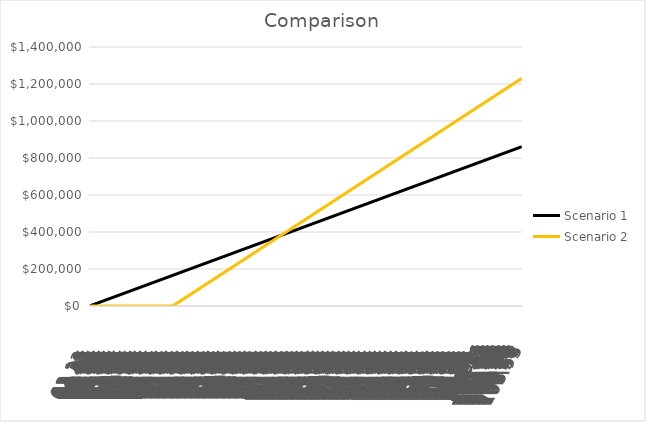
| Category | Scenario 1 | Scenario 2 |
|---|---|---|
| 62.11780821917808 | 1725.5 | 0 |
| 62.202739726027396 | 3451.001 | 0 |
| 62.28493150684932 | 5176.501 | 0 |
| 62.36986301369863 | 6902.002 | 0 |
| 62.45479452054794 | 8627.502 | 0 |
| 62.53150684931507 | 10353.003 | 0 |
| 62.61643835616438 | 12078.503 | 0 |
| 62.6986301369863 | 13804.004 | 0 |
| 62.78356164383562 | 15529.504 | 0 |
| 62.865753424657534 | 17255.005 | 0 |
| 62.95068493150685 | 18980.505 | 0 |
| 63.035616438356165 | 20706.006 | 0 |
| 63.11780821917808 | 22431.506 | 0 |
| 63.202739726027396 | 24157.007 | 0 |
| 63.28493150684932 | 25882.507 | 0 |
| 63.36986301369863 | 27608.008 | 0 |
| 63.45479452054794 | 29333.508 | 0 |
| 63.53150684931507 | 31059.009 | 0 |
| 63.61643835616438 | 32784.509 | 0 |
| 63.6986301369863 | 34510.01 | 0 |
| 63.78356164383562 | 36235.51 | 0 |
| 63.865753424657534 | 37961.011 | 0 |
| 63.95068493150685 | 39686.511 | 0 |
| 64.03561643835616 | 41412.012 | 0 |
| 64.11780821917809 | 43137.512 | 0 |
| 64.2027397260274 | 44863.013 | 0 |
| 64.28493150684932 | 46588.513 | 0 |
| 64.36986301369863 | 48314.014 | 0 |
| 64.45479452054795 | 50039.514 | 0 |
| 64.53424657534246 | 51765.015 | 0 |
| 64.61917808219178 | 53490.515 | 0 |
| 64.7013698630137 | 55216.016 | 0 |
| 64.78630136986301 | 56941.516 | 0 |
| 64.86849315068493 | 58667.017 | 0 |
| 64.95342465753424 | 60392.517 | 0 |
| 65.03835616438356 | 62118.018 | 0 |
| 65.12054794520547 | 63843.518 | 0 |
| 65.20547945205479 | 65569.019 | 0 |
| 65.28767123287672 | 67294.519 | 0 |
| 65.37260273972603 | 69020.019 | 0 |
| 65.45753424657535 | 70745.52 | 0 |
| 65.53424657534246 | 72471.02 | 0 |
| 65.61917808219178 | 74196.521 | 0 |
| 65.7013698630137 | 75922.021 | 0 |
| 65.78630136986301 | 77647.522 | 0 |
| 65.86849315068493 | 79373.022 | 0 |
| 65.95342465753424 | 81098.523 | 0 |
| 66.03835616438356 | 82824.023 | 0 |
| 66.12054794520547 | 84549.524 | 0 |
| 66.20547945205479 | 86275.024 | 0 |
| 66.28767123287672 | 88000.525 | 0 |
| 66.37260273972603 | 89726.025 | 0 |
| 66.45753424657535 | 91451.526 | 0 |
| 66.53424657534246 | 93177.026 | 0 |
| 66.61917808219178 | 94902.527 | 0 |
| 66.7013698630137 | 96628.027 | 0 |
| 66.78630136986301 | 98353.528 | 0 |
| 66.86849315068493 | 100079.028 | 0 |
| 66.95342465753424 | 101804.529 | 0 |
| 67.03835616438356 | 103530.029 | 0 |
| 67.12054794520547 | 105255.53 | 0 |
| 67.20547945205479 | 106981.03 | 0 |
| 67.28767123287672 | 108706.531 | 0 |
| 67.37260273972603 | 110432.031 | 0 |
| 67.45753424657535 | 112157.532 | 0 |
| 67.53424657534246 | 113883.032 | 0 |
| 67.61917808219178 | 115608.533 | 0 |
| 67.7013698630137 | 117334.033 | 0 |
| 67.78630136986301 | 119059.534 | 0 |
| 67.86849315068493 | 120785.034 | 0 |
| 67.95342465753424 | 122510.535 | 0 |
| 68.03835616438356 | 124236.035 | 0 |
| 68.12054794520547 | 125961.536 | 0 |
| 68.20547945205479 | 127687.036 | 0 |
| 68.28767123287672 | 129412.537 | 0 |
| 68.37260273972603 | 131138.037 | 0 |
| 68.45753424657535 | 132863.538 | 0 |
| 68.53698630136986 | 134589.038 | 0 |
| 68.62191780821918 | 136314.538 | 0 |
| 68.7041095890411 | 138040.039 | 0 |
| 68.78904109589041 | 139765.539 | 0 |
| 68.87123287671233 | 141491.04 | 0 |
| 68.95616438356164 | 143216.54 | 0 |
| 69.04109589041096 | 144942.041 | 0 |
| 69.12328767123287 | 146667.541 | 0 |
| 69.20821917808219 | 148393.042 | 0 |
| 69.2904109589041 | 150118.542 | 0 |
| 69.37534246575342 | 151844.043 | 0 |
| 69.46027397260274 | 153569.543 | 0 |
| 69.53698630136986 | 155295.044 | 0 |
| 69.62191780821918 | 157020.544 | 0 |
| 69.7041095890411 | 158746.045 | 0 |
| 69.78904109589041 | 160471.545 | 0 |
| 69.87123287671233 | 162197.046 | 0 |
| 69.95616438356164 | 163922.546 | 0 |
| 70.04109589041096 | 165648.047 | 0 |
| 70.12328767123287 | 167373.547 | 3053.12 |
| 70.20821917808219 | 169099.048 | 6106.24 |
| 70.2904109589041 | 170824.548 | 9159.36 |
| 70.37534246575342 | 172550.049 | 12212.48 |
| 70.46027397260274 | 174275.549 | 15265.6 |
| 70.53698630136986 | 176001.05 | 18318.72 |
| 70.62191780821918 | 177726.55 | 21371.84 |
| 70.7041095890411 | 179452.051 | 24424.96 |
| 70.78904109589041 | 181177.551 | 27478.08 |
| 70.87123287671233 | 182903.052 | 30531.2 |
| 70.95616438356164 | 184628.552 | 33584.32 |
| 71.04109589041096 | 186354.053 | 36637.44 |
| 71.12328767123287 | 188079.553 | 39690.56 |
| 71.20821917808219 | 189805.054 | 42743.68 |
| 71.2904109589041 | 191530.554 | 45796.8 |
| 71.37534246575342 | 193256.055 | 48849.92 |
| 71.46027397260274 | 194981.555 | 51903.04 |
| 71.53698630136986 | 196707.056 | 54956.16 |
| 71.62191780821918 | 198432.556 | 58009.28 |
| 71.7041095890411 | 200158.056 | 61062.4 |
| 71.78904109589041 | 201883.557 | 64115.52 |
| 71.87123287671233 | 203609.057 | 67168.64 |
| 71.95616438356164 | 205334.558 | 70221.76 |
| 72.04109589041096 | 207060.058 | 73274.88 |
| 72.12328767123287 | 208785.559 | 76328 |
| 72.20821917808219 | 210511.059 | 79381.12 |
| 72.2904109589041 | 212236.56 | 82434.24 |
| 72.37534246575342 | 213962.06 | 85487.36 |
| 72.46027397260274 | 215687.561 | 88540.48 |
| 72.53972602739726 | 217413.061 | 91593.6 |
| 72.62465753424658 | 219138.562 | 94646.72 |
| 72.7068493150685 | 220864.062 | 97699.84 |
| 72.79178082191781 | 222589.563 | 100752.96 |
| 72.87397260273973 | 224315.063 | 103806.08 |
| 72.95890410958904 | 226040.564 | 106859.2 |
| 73.04383561643836 | 227766.064 | 109912.32 |
| 73.12602739726027 | 229491.565 | 112965.44 |
| 73.21095890410959 | 231217.065 | 116018.56 |
| 73.2931506849315 | 232942.566 | 119071.68 |
| 73.37808219178082 | 234668.066 | 122124.8 |
| 73.46301369863014 | 236393.567 | 125177.92 |
| 73.53972602739726 | 238119.067 | 128231.04 |
| 73.62465753424658 | 239844.568 | 131284.16 |
| 73.7068493150685 | 241570.068 | 134337.28 |
| 73.79178082191781 | 243295.569 | 137390.4 |
| 73.87397260273973 | 245021.069 | 140443.52 |
| 73.95890410958904 | 246746.57 | 143496.64 |
| 74.04383561643836 | 248472.07 | 146549.76 |
| 74.12602739726027 | 250197.571 | 149602.88 |
| 74.21095890410959 | 251923.071 | 152656 |
| 74.2931506849315 | 253648.572 | 155709.12 |
| 74.37808219178082 | 255374.072 | 158762.24 |
| 74.46301369863014 | 257099.573 | 161815.36 |
| 74.53972602739726 | 258825.073 | 164868.48 |
| 74.62465753424658 | 260550.574 | 167921.6 |
| 74.7068493150685 | 262276.074 | 170974.72 |
| 74.79178082191781 | 264001.575 | 174027.84 |
| 74.87397260273973 | 265727.075 | 177080.96 |
| 74.95890410958904 | 267452.575 | 180134.08 |
| 75.04383561643836 | 269178.076 | 183187.2 |
| 75.12602739726027 | 270903.576 | 186240.32 |
| 75.21095890410959 | 272629.077 | 189293.44 |
| 75.2931506849315 | 274354.577 | 192346.56 |
| 75.37808219178082 | 276080.078 | 195399.68 |
| 75.46301369863014 | 277805.578 | 198452.8 |
| 75.53972602739726 | 279531.079 | 201505.92 |
| 75.62465753424658 | 281256.579 | 204559.04 |
| 75.7068493150685 | 282982.08 | 207612.16 |
| 75.79178082191781 | 284707.58 | 210665.28 |
| 75.87397260273973 | 286433.081 | 213718.4 |
| 75.95890410958904 | 288158.581 | 216771.52 |
| 76.04383561643836 | 289884.082 | 219824.64 |
| 76.12602739726027 | 291609.582 | 222877.76 |
| 76.21095890410959 | 293335.083 | 225930.88 |
| 76.2931506849315 | 295060.583 | 228984 |
| 76.37808219178082 | 296786.084 | 232037.12 |
| 76.46301369863014 | 298511.584 | 235090.24 |
| 76.54246575342465 | 300237.085 | 238143.36 |
| 76.62739726027397 | 301962.585 | 241196.48 |
| 76.7095890410959 | 303688.086 | 244249.6 |
| 76.79452054794521 | 305413.586 | 247302.72 |
| 76.87671232876713 | 307139.087 | 250355.84 |
| 76.96164383561644 | 308864.587 | 253408.96 |
| 77.04657534246576 | 310590.088 | 256462.08 |
| 77.12876712328767 | 312315.588 | 259515.2 |
| 77.21369863013699 | 314041.089 | 262568.32 |
| 77.2958904109589 | 315766.589 | 265621.44 |
| 77.38082191780822 | 317492.09 | 268674.56 |
| 77.46575342465754 | 319217.59 | 271727.68 |
| 77.54246575342465 | 320943.091 | 274780.8 |
| 77.62739726027397 | 322668.591 | 277833.92 |
| 77.7095890410959 | 324394.092 | 280887.04 |
| 77.79452054794521 | 326119.592 | 283940.16 |
| 77.87671232876713 | 327845.093 | 286993.28 |
| 77.96164383561644 | 329570.593 | 290046.4 |
| 78.04657534246576 | 331296.094 | 293099.52 |
| 78.12876712328767 | 333021.594 | 296152.64 |
| 78.21369863013699 | 334747.094 | 299205.76 |
| 78.2958904109589 | 336472.595 | 302258.88 |
| 78.38082191780822 | 338198.095 | 305312 |
| 78.46575342465754 | 339923.596 | 308365.12 |
| 78.54246575342465 | 341649.096 | 311418.24 |
| 78.62739726027397 | 343374.597 | 314471.36 |
| 78.7095890410959 | 345100.097 | 317524.48 |
| 78.79452054794521 | 346825.598 | 320577.6 |
| 78.87671232876713 | 348551.098 | 323630.72 |
| 78.96164383561644 | 350276.599 | 326683.84 |
| 79.04657534246576 | 352002.099 | 329736.96 |
| 79.12876712328767 | 353727.6 | 332790.08 |
| 79.21369863013699 | 355453.1 | 335843.2 |
| 79.2958904109589 | 357178.601 | 338896.32 |
| 79.38082191780822 | 358904.101 | 341949.44 |
| 79.46575342465754 | 360629.602 | 345002.56 |
| 79.54246575342465 | 362355.102 | 348055.68 |
| 79.62739726027397 | 364080.603 | 351108.8 |
| 79.7095890410959 | 365806.103 | 354161.92 |
| 79.79452054794521 | 367531.604 | 357215.04 |
| 79.87671232876713 | 369257.104 | 360268.16 |
| 79.96164383561644 | 370982.605 | 363321.28 |
| 80.04657534246576 | 372708.105 | 366374.4 |
| 80.12876712328767 | 374433.606 | 369427.52 |
| 80.21369863013699 | 376159.106 | 372480.64 |
| 80.2958904109589 | 377884.607 | 375533.76 |
| 80.38082191780822 | 379610.107 | 378586.88 |
| 80.46575342465754 | 381335.608 | 381640 |
| 80.54520547945205 | 383061.108 | 384693.12 |
| 80.63013698630137 | 384786.609 | 387746.24 |
| 80.71232876712328 | 386512.109 | 390799.36 |
| 80.7972602739726 | 388237.61 | 393852.48 |
| 80.87945205479453 | 389963.11 | 396905.6 |
| 80.96438356164384 | 391688.611 | 399958.72 |
| 81.04931506849314 | 393414.111 | 403011.84 |
| 81.13150684931507 | 395139.612 | 406064.96 |
| 81.21643835616439 | 396865.112 | 409118.08 |
| 81.2986301369863 | 398590.613 | 412171.2 |
| 81.38356164383562 | 400316.113 | 415224.32 |
| 81.46849315068494 | 402041.613 | 418277.44 |
| 81.54520547945205 | 403767.114 | 421330.56 |
| 81.63013698630137 | 405492.614 | 424383.68 |
| 81.71232876712328 | 407218.115 | 427436.8 |
| 81.7972602739726 | 408943.615 | 430489.92 |
| 81.87945205479453 | 410669.116 | 433543.04 |
| 81.96438356164384 | 412394.616 | 436596.16 |
| 82.04931506849314 | 414120.117 | 439649.28 |
| 82.13150684931507 | 415845.617 | 442702.4 |
| 82.21643835616439 | 417571.118 | 445755.52 |
| 82.2986301369863 | 419296.618 | 448808.64 |
| 82.38356164383562 | 421022.119 | 451861.76 |
| 82.46849315068494 | 422747.619 | 454914.88 |
| 82.54520547945205 | 424473.12 | 457968 |
| 82.63013698630137 | 426198.62 | 461021.12 |
| 82.71232876712328 | 427924.121 | 464074.24 |
| 82.7972602739726 | 429649.621 | 467127.36 |
| 82.87945205479453 | 431375.122 | 470180.48 |
| 82.96438356164384 | 433100.622 | 473233.6 |
| 83.04931506849314 | 434826.123 | 476286.72 |
| 83.13150684931507 | 436551.623 | 479339.84 |
| 83.21643835616439 | 438277.124 | 482392.96 |
| 83.2986301369863 | 440002.624 | 485446.08 |
| 83.38356164383562 | 441728.125 | 488499.2 |
| 83.46849315068494 | 443453.625 | 491552.32 |
| 83.54520547945205 | 445179.126 | 494605.44 |
| 83.63013698630137 | 446904.626 | 497658.56 |
| 83.71232876712328 | 448630.127 | 500711.68 |
| 83.7972602739726 | 450355.627 | 503764.8 |
| 83.87945205479453 | 452081.128 | 506817.92 |
| 83.96438356164384 | 453806.628 | 509871.04 |
| 84.04931506849314 | 455532.129 | 512924.16 |
| 84.13150684931507 | 457257.629 | 515977.28 |
| 84.21643835616439 | 458983.13 | 519030.4 |
| 84.2986301369863 | 460708.63 | 522083.52 |
| 84.38356164383562 | 462434.131 | 525136.64 |
| 84.46849315068494 | 464159.631 | 528189.76 |
| 84.54794520547945 | 465885.131 | 531242.88 |
| 84.63287671232877 | 467610.632 | 534296 |
| 84.71506849315068 | 469336.132 | 537349.12 |
| 84.8 | 471061.633 | 540402.24 |
| 84.88219178082191 | 472787.133 | 543455.36 |
| 84.96712328767123 | 474512.634 | 546508.48 |
| 85.05205479452054 | 476238.134 | 549561.6 |
| 85.13424657534246 | 477963.635 | 552614.72 |
| 85.21917808219177 | 479689.135 | 555667.84 |
| 85.3013698630137 | 481414.636 | 558720.96 |
| 85.38630136986302 | 483140.136 | 561774.08 |
| 85.47123287671234 | 484865.637 | 564827.2 |
| 85.54794520547945 | 486591.137 | 567880.32 |
| 85.63287671232877 | 488316.638 | 570933.44 |
| 85.71506849315068 | 490042.138 | 573986.56 |
| 85.8 | 491767.639 | 577039.68 |
| 85.88219178082191 | 493493.139 | 580092.8 |
| 85.96712328767123 | 495218.64 | 583145.92 |
| 86.05205479452054 | 496944.14 | 586199.04 |
| 86.13424657534246 | 498669.641 | 589252.16 |
| 86.21917808219177 | 500395.141 | 592305.28 |
| 86.3013698630137 | 502120.642 | 595358.4 |
| 86.38630136986302 | 503846.142 | 598411.52 |
| 86.47123287671234 | 505571.643 | 601464.64 |
| 86.54794520547945 | 507297.143 | 604517.76 |
| 86.63287671232877 | 509022.644 | 607570.88 |
| 86.71506849315068 | 510748.144 | 610624 |
| 86.8 | 512473.645 | 613677.12 |
| 86.88219178082191 | 514199.145 | 616730.24 |
| 86.96712328767123 | 515924.646 | 619783.36 |
| 87.05205479452054 | 517650.146 | 622836.48 |
| 87.13424657534246 | 519375.647 | 625889.6 |
| 87.21917808219177 | 521101.147 | 628942.72 |
| 87.3013698630137 | 522826.648 | 631995.84 |
| 87.38630136986302 | 524552.148 | 635048.96 |
| 87.47123287671234 | 526277.649 | 638102.08 |
| 87.54794520547945 | 528003.149 | 641155.2 |
| 87.63287671232877 | 529728.65 | 644208.32 |
| 87.71506849315068 | 531454.15 | 647261.44 |
| 87.8 | 533179.65 | 650314.56 |
| 87.88219178082191 | 534905.151 | 653367.68 |
| 87.96712328767123 | 536630.651 | 656420.8 |
| 88.05205479452054 | 538356.152 | 659473.92 |
| 88.13424657534246 | 540081.652 | 662527.04 |
| 88.21917808219177 | 541807.153 | 665580.16 |
| 88.3013698630137 | 543532.653 | 668633.28 |
| 88.38630136986302 | 545258.154 | 671686.4 |
| 88.47123287671234 | 546983.654 | 674739.52 |
| 88.55068493150685 | 548709.155 | 677792.64 |
| 88.63561643835617 | 550434.655 | 680845.76 |
| 88.71780821917808 | 552160.156 | 683898.88 |
| 88.8027397260274 | 553885.656 | 686952 |
| 88.88493150684931 | 555611.157 | 690005.12 |
| 88.96986301369863 | 557336.657 | 693058.24 |
| 89.05479452054794 | 559062.158 | 696111.36 |
| 89.13698630136986 | 560787.658 | 699164.48 |
| 89.22191780821917 | 562513.159 | 702217.6 |
| 89.30410958904109 | 564238.659 | 705270.72 |
| 89.3890410958904 | 565964.16 | 708323.84 |
| 89.47397260273972 | 567689.66 | 711376.96 |
| 89.55068493150685 | 569415.161 | 714430.08 |
| 89.63561643835617 | 571140.661 | 717483.2 |
| 89.71780821917808 | 572866.162 | 720536.32 |
| 89.8027397260274 | 574591.662 | 723589.44 |
| 89.88493150684931 | 576317.163 | 726642.56 |
| 89.96986301369863 | 578042.663 | 729695.68 |
| 90.05479452054794 | 579768.164 | 732748.8 |
| 90.13698630136986 | 581493.664 | 735801.92 |
| 90.22191780821917 | 583219.165 | 738855.04 |
| 90.30410958904109 | 584944.665 | 741908.16 |
| 90.3890410958904 | 586670.166 | 744961.28 |
| 90.47397260273972 | 588395.666 | 748014.4 |
| 90.55068493150685 | 590121.167 | 751067.52 |
| 90.63561643835617 | 591846.667 | 754120.64 |
| 90.71780821917808 | 593572.168 | 757173.76 |
| 90.8027397260274 | 595297.668 | 760226.88 |
| 90.88493150684931 | 597023.169 | 763280 |
| 90.96986301369863 | 598748.669 | 766333.12 |
| 91.05479452054794 | 600474.169 | 769386.24 |
| 91.13698630136986 | 602199.67 | 772439.36 |
| 91.22191780821917 | 603925.17 | 775492.48 |
| 91.30410958904109 | 605650.671 | 778545.6 |
| 91.3890410958904 | 607376.171 | 781598.72 |
| 91.47397260273972 | 609101.672 | 784651.84 |
| 91.55068493150685 | 610827.172 | 787704.96 |
| 91.63561643835617 | 612552.673 | 790758.08 |
| 91.71780821917808 | 614278.173 | 793811.2 |
| 91.8027397260274 | 616003.674 | 796864.32 |
| 91.88493150684931 | 617729.174 | 799917.44 |
| 91.96986301369863 | 619454.675 | 802970.56 |
| 92.05479452054794 | 621180.175 | 806023.68 |
| 92.13698630136986 | 622905.676 | 809076.8 |
| 92.22191780821917 | 624631.176 | 812129.92 |
| 92.30410958904109 | 626356.677 | 815183.04 |
| 92.3890410958904 | 628082.177 | 818236.16 |
| 92.47397260273972 | 629807.678 | 821289.28 |
| 92.55342465753425 | 631533.178 | 824342.4 |
| 92.63835616438357 | 633258.679 | 827395.52 |
| 92.72054794520548 | 634984.179 | 830448.64 |
| 92.8054794520548 | 636709.68 | 833501.76 |
| 92.88767123287671 | 638435.18 | 836554.88 |
| 92.97260273972603 | 640160.681 | 839608 |
| 93.05753424657534 | 641886.181 | 842661.12 |
| 93.13972602739726 | 643611.682 | 845714.24 |
| 93.22465753424657 | 645337.182 | 848767.36 |
| 93.30684931506849 | 647062.683 | 851820.48 |
| 93.3917808219178 | 648788.183 | 854873.6 |
| 93.47671232876712 | 650513.684 | 857926.72 |
| 93.55342465753425 | 652239.184 | 860979.84 |
| 93.63835616438357 | 653964.685 | 864032.96 |
| 93.72054794520548 | 655690.185 | 867086.08 |
| 93.8054794520548 | 657415.686 | 870139.2 |
| 93.88767123287671 | 659141.186 | 873192.32 |
| 93.97260273972603 | 660866.687 | 876245.44 |
| 94.05753424657534 | 662592.187 | 879298.56 |
| 94.13972602739726 | 664317.688 | 882351.68 |
| 94.22465753424657 | 666043.188 | 885404.8 |
| 94.30684931506849 | 667768.688 | 888457.92 |
| 94.3917808219178 | 669494.189 | 891511.04 |
| 94.47671232876712 | 671219.689 | 894564.16 |
| 94.55342465753425 | 672945.19 | 897617.28 |
| 94.63835616438357 | 674670.69 | 900670.4 |
| 94.72054794520548 | 676396.191 | 903723.52 |
| 94.8054794520548 | 678121.691 | 906776.64 |
| 94.88767123287671 | 679847.192 | 909829.76 |
| 94.97260273972603 | 681572.692 | 912882.88 |
| 95.05753424657534 | 683298.193 | 915936 |
| 95.13972602739726 | 685023.693 | 918989.12 |
| 95.22465753424657 | 686749.194 | 922042.24 |
| 95.30684931506849 | 688474.694 | 925095.36 |
| 95.3917808219178 | 690200.195 | 928148.48 |
| 95.47671232876712 | 691925.695 | 931201.6 |
| 95.55342465753425 | 693651.196 | 934254.72 |
| 95.63835616438357 | 695376.696 | 937307.84 |
| 95.72054794520548 | 697102.197 | 940360.96 |
| 95.8054794520548 | 698827.697 | 943414.08 |
| 95.88767123287671 | 700553.198 | 946467.2 |
| 95.97260273972603 | 702278.698 | 949520.32 |
| 96.05753424657534 | 704004.199 | 952573.44 |
| 96.13972602739726 | 705729.699 | 955626.56 |
| 96.22465753424657 | 707455.2 | 958679.68 |
| 96.30684931506849 | 709180.7 | 961732.8 |
| 96.3917808219178 | 710906.201 | 964785.92 |
| 96.47671232876712 | 712631.701 | 967839.04 |
| 96.55616438356165 | 714357.202 | 970892.16 |
| 96.64109589041095 | 716082.702 | 973945.28 |
| 96.72328767123288 | 717808.203 | 976998.4 |
| 96.8082191780822 | 719533.703 | 980051.52 |
| 96.89041095890411 | 721259.204 | 983104.64 |
| 96.97534246575343 | 722984.704 | 986157.76 |
| 97.06027397260274 | 724710.205 | 989210.88 |
| 97.14246575342466 | 726435.705 | 992264 |
| 97.22739726027397 | 728161.206 | 995317.12 |
| 97.30958904109589 | 729886.706 | 998370.24 |
| 97.3945205479452 | 731612.206 | 1001423.36 |
| 97.47945205479452 | 733337.707 | 1004476.48 |
| 97.55616438356165 | 735063.207 | 1007529.6 |
| 97.64109589041095 | 736788.708 | 1010582.72 |
| 97.72328767123288 | 738514.208 | 1013635.84 |
| 97.8082191780822 | 740239.709 | 1016688.96 |
| 97.89041095890411 | 741965.209 | 1019742.08 |
| 97.97534246575343 | 743690.71 | 1022795.2 |
| 98.06027397260274 | 745416.21 | 1025848.32 |
| 98.14246575342466 | 747141.711 | 1028901.44 |
| 98.22739726027397 | 748867.211 | 1031954.56 |
| 98.30958904109589 | 750592.712 | 1035007.68 |
| 98.3945205479452 | 752318.212 | 1038060.8 |
| 98.47945205479452 | 754043.713 | 1041113.92 |
| 98.55616438356165 | 755769.213 | 1044167.04 |
| 98.64109589041095 | 757494.714 | 1047220.16 |
| 98.72328767123288 | 759220.214 | 1050273.28 |
| 98.8082191780822 | 760945.715 | 1053326.4 |
| 98.89041095890411 | 762671.215 | 1056379.52 |
| 98.97534246575343 | 764396.716 | 1059432.64 |
| 99.06027397260274 | 766122.216 | 1062485.76 |
| 99.14246575342466 | 767847.717 | 1065538.88 |
| 99.22739726027397 | 769573.217 | 1068592 |
| 99.30958904109589 | 771298.718 | 1071645.12 |
| 99.3945205479452 | 773024.218 | 1074698.24 |
| 99.47945205479452 | 774749.719 | 1077751.36 |
| 99.55616438356165 | 776475.219 | 1080804.48 |
| 99.64109589041095 | 778200.72 | 1083857.6 |
| 99.72328767123288 | 779926.22 | 1086910.72 |
| 99.8082191780822 | 781651.721 | 1089963.84 |
| 99.89041095890411 | 783377.221 | 1093016.96 |
| 99.97534246575343 | 785102.722 | 1096070.08 |
| 100.06027397260274 | 786828.222 | 1099123.2 |
| 100.14246575342466 | 788553.723 | 1102176.32 |
| 100.22739726027397 | 790279.223 | 1105229.44 |
| 100.30958904109589 | 792004.724 | 1108282.56 |
| 100.3945205479452 | 793730.224 | 1111335.68 |
| 100.47945205479452 | 795455.725 | 1114388.8 |
| 100.55890410958904 | 797181.225 | 1117441.92 |
| 100.64383561643835 | 798906.725 | 1120495.04 |
| 100.72602739726027 | 800632.226 | 1123548.16 |
| 100.81095890410958 | 802357.726 | 1126601.28 |
| 100.89315068493151 | 804083.227 | 1129654.4 |
| 100.97808219178083 | 805808.727 | 1132707.52 |
| 101.06301369863014 | 807534.228 | 1135760.64 |
| 101.14520547945206 | 809259.728 | 1138813.76 |
| 101.23013698630137 | 810985.229 | 1141866.88 |
| 101.31232876712329 | 812710.729 | 1144920 |
| 101.3972602739726 | 814436.23 | 1147973.12 |
| 101.48219178082192 | 816161.73 | 1151026.24 |
| 101.55890410958904 | 817887.231 | 1154079.36 |
| 101.64383561643835 | 819612.731 | 1157132.48 |
| 101.72602739726027 | 821338.232 | 1160185.6 |
| 101.81095890410958 | 823063.732 | 1163238.72 |
| 101.89315068493151 | 824789.233 | 1166291.84 |
| 101.97808219178083 | 826514.733 | 1169344.96 |
| 102.06301369863014 | 828240.234 | 1172398.08 |
| 102.14520547945206 | 829965.734 | 1175451.2 |
| 102.23013698630137 | 831691.235 | 1178504.32 |
| 102.31232876712329 | 833416.735 | 1181557.44 |
| 102.3972602739726 | 835142.236 | 1184610.56 |
| 102.48219178082192 | 836867.736 | 1187663.68 |
| 102.55890410958904 | 838593.237 | 1190716.8 |
| 102.64383561643835 | 840318.737 | 1193769.92 |
| 102.72602739726027 | 842044.238 | 1196823.04 |
| 102.81095890410958 | 843769.738 | 1199876.16 |
| 102.89315068493151 | 845495.239 | 1202929.28 |
| 102.97808219178083 | 847220.739 | 1205982.4 |
| 103.06301369863014 | 848946.24 | 1209035.52 |
| 103.14520547945206 | 850671.74 | 1212088.64 |
| 103.23013698630137 | 852397.241 | 1215141.76 |
| 103.31232876712329 | 854122.741 | 1218194.88 |
| 103.3972602739726 | 855848.242 | 1221248 |
| 103.48219178082192 | 857573.742 | 1224301.12 |
| 103.55890410958904 | 859299.243 | 1227354.24 |
| 103.64383561643835 | 861024.743 | 1230407.36 |
| 103.72602739726027 | 862750.244 | 1233460.48 |